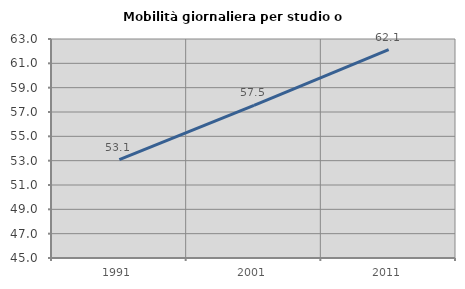
| Category | Mobilità giornaliera per studio o lavoro |
|---|---|
| 1991.0 | 53.082 |
| 2001.0 | 57.542 |
| 2011.0 | 62.119 |